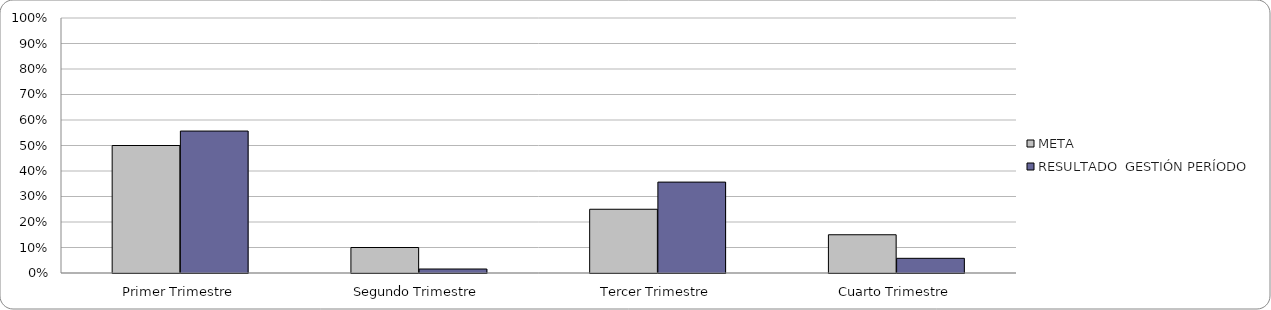
| Category | META | RESULTADO  GESTIÓN PERÍODO |
|---|---|---|
| Primer Trimestre | 0.5 | 0.557 |
| Segundo Trimestre | 0.1 | 0.016 |
| Tercer Trimestre | 0.25 | 0.356 |
| Cuarto Trimestre | 0.15 | 0.058 |